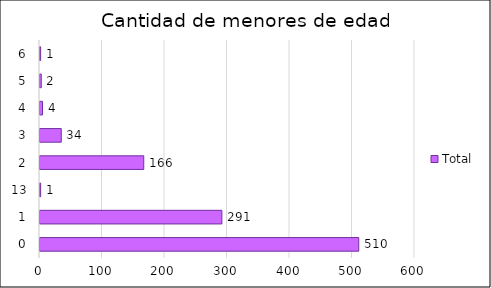
| Category | Total |
|---|---|
| 0 | 510 |
| 1 | 291 |
| 13 | 1 |
| 2 | 166 |
| 3 | 34 |
| 4 | 4 |
| 5 | 2 |
| 6 | 1 |